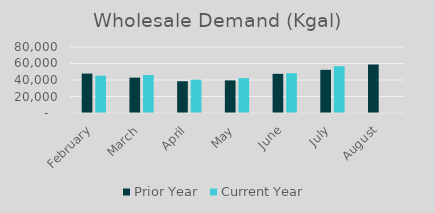
| Category | Prior Year | Current Year |
|---|---|---|
| February | 47777 | 45213 |
| March | 42881 | 46053 |
| April | 38510 | 40390 |
| May | 39535 | 42282 |
| June | 47488 | 48210 |
| July | 52336 | 56754 |
| August | 58778 | 0 |